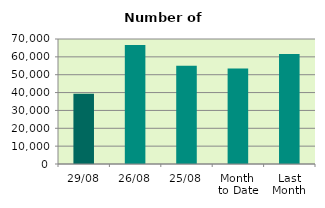
| Category | Series 0 |
|---|---|
| 29/08 | 39354 |
| 26/08 | 66660 |
| 25/08 | 55086 |
| Month 
to Date | 53468.476 |
| Last
Month | 61549.619 |